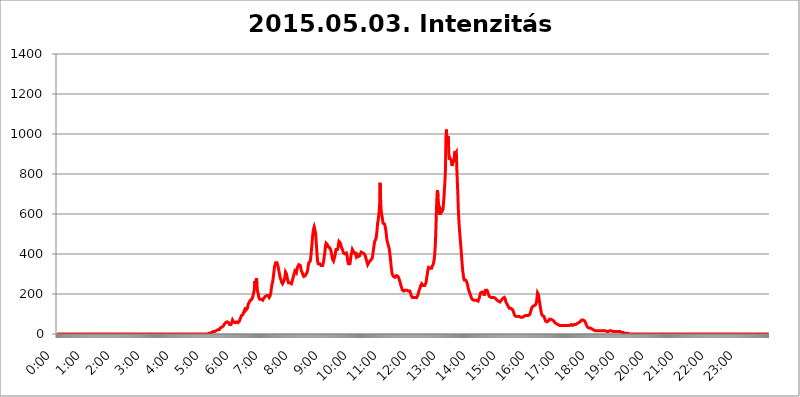
| Category | 2015.05.03. Intenzitás [W/m^2] |
|---|---|
| 0.0 | 0 |
| 0.0006944444444444445 | 0 |
| 0.001388888888888889 | 0 |
| 0.0020833333333333333 | 0 |
| 0.002777777777777778 | 0 |
| 0.003472222222222222 | 0 |
| 0.004166666666666667 | 0 |
| 0.004861111111111111 | 0 |
| 0.005555555555555556 | 0 |
| 0.0062499999999999995 | 0 |
| 0.006944444444444444 | 0 |
| 0.007638888888888889 | 0 |
| 0.008333333333333333 | 0 |
| 0.009027777777777779 | 0 |
| 0.009722222222222222 | 0 |
| 0.010416666666666666 | 0 |
| 0.011111111111111112 | 0 |
| 0.011805555555555555 | 0 |
| 0.012499999999999999 | 0 |
| 0.013194444444444444 | 0 |
| 0.013888888888888888 | 0 |
| 0.014583333333333332 | 0 |
| 0.015277777777777777 | 0 |
| 0.015972222222222224 | 0 |
| 0.016666666666666666 | 0 |
| 0.017361111111111112 | 0 |
| 0.018055555555555557 | 0 |
| 0.01875 | 0 |
| 0.019444444444444445 | 0 |
| 0.02013888888888889 | 0 |
| 0.020833333333333332 | 0 |
| 0.02152777777777778 | 0 |
| 0.022222222222222223 | 0 |
| 0.02291666666666667 | 0 |
| 0.02361111111111111 | 0 |
| 0.024305555555555556 | 0 |
| 0.024999999999999998 | 0 |
| 0.025694444444444447 | 0 |
| 0.02638888888888889 | 0 |
| 0.027083333333333334 | 0 |
| 0.027777777777777776 | 0 |
| 0.02847222222222222 | 0 |
| 0.029166666666666664 | 0 |
| 0.029861111111111113 | 0 |
| 0.030555555555555555 | 0 |
| 0.03125 | 0 |
| 0.03194444444444445 | 0 |
| 0.03263888888888889 | 0 |
| 0.03333333333333333 | 0 |
| 0.034027777777777775 | 0 |
| 0.034722222222222224 | 0 |
| 0.035416666666666666 | 0 |
| 0.036111111111111115 | 0 |
| 0.03680555555555556 | 0 |
| 0.0375 | 0 |
| 0.03819444444444444 | 0 |
| 0.03888888888888889 | 0 |
| 0.03958333333333333 | 0 |
| 0.04027777777777778 | 0 |
| 0.04097222222222222 | 0 |
| 0.041666666666666664 | 0 |
| 0.042361111111111106 | 0 |
| 0.04305555555555556 | 0 |
| 0.043750000000000004 | 0 |
| 0.044444444444444446 | 0 |
| 0.04513888888888889 | 0 |
| 0.04583333333333334 | 0 |
| 0.04652777777777778 | 0 |
| 0.04722222222222222 | 0 |
| 0.04791666666666666 | 0 |
| 0.04861111111111111 | 0 |
| 0.049305555555555554 | 0 |
| 0.049999999999999996 | 0 |
| 0.05069444444444445 | 0 |
| 0.051388888888888894 | 0 |
| 0.052083333333333336 | 0 |
| 0.05277777777777778 | 0 |
| 0.05347222222222222 | 0 |
| 0.05416666666666667 | 0 |
| 0.05486111111111111 | 0 |
| 0.05555555555555555 | 0 |
| 0.05625 | 0 |
| 0.05694444444444444 | 0 |
| 0.057638888888888885 | 0 |
| 0.05833333333333333 | 0 |
| 0.05902777777777778 | 0 |
| 0.059722222222222225 | 0 |
| 0.06041666666666667 | 0 |
| 0.061111111111111116 | 0 |
| 0.06180555555555556 | 0 |
| 0.0625 | 0 |
| 0.06319444444444444 | 0 |
| 0.06388888888888888 | 0 |
| 0.06458333333333334 | 0 |
| 0.06527777777777778 | 0 |
| 0.06597222222222222 | 0 |
| 0.06666666666666667 | 0 |
| 0.06736111111111111 | 0 |
| 0.06805555555555555 | 0 |
| 0.06874999999999999 | 0 |
| 0.06944444444444443 | 0 |
| 0.07013888888888889 | 0 |
| 0.07083333333333333 | 0 |
| 0.07152777777777779 | 0 |
| 0.07222222222222223 | 0 |
| 0.07291666666666667 | 0 |
| 0.07361111111111111 | 0 |
| 0.07430555555555556 | 0 |
| 0.075 | 0 |
| 0.07569444444444444 | 0 |
| 0.0763888888888889 | 0 |
| 0.07708333333333334 | 0 |
| 0.07777777777777778 | 0 |
| 0.07847222222222222 | 0 |
| 0.07916666666666666 | 0 |
| 0.0798611111111111 | 0 |
| 0.08055555555555556 | 0 |
| 0.08125 | 0 |
| 0.08194444444444444 | 0 |
| 0.08263888888888889 | 0 |
| 0.08333333333333333 | 0 |
| 0.08402777777777777 | 0 |
| 0.08472222222222221 | 0 |
| 0.08541666666666665 | 0 |
| 0.08611111111111112 | 0 |
| 0.08680555555555557 | 0 |
| 0.08750000000000001 | 0 |
| 0.08819444444444445 | 0 |
| 0.08888888888888889 | 0 |
| 0.08958333333333333 | 0 |
| 0.09027777777777778 | 0 |
| 0.09097222222222222 | 0 |
| 0.09166666666666667 | 0 |
| 0.09236111111111112 | 0 |
| 0.09305555555555556 | 0 |
| 0.09375 | 0 |
| 0.09444444444444444 | 0 |
| 0.09513888888888888 | 0 |
| 0.09583333333333333 | 0 |
| 0.09652777777777777 | 0 |
| 0.09722222222222222 | 0 |
| 0.09791666666666667 | 0 |
| 0.09861111111111111 | 0 |
| 0.09930555555555555 | 0 |
| 0.09999999999999999 | 0 |
| 0.10069444444444443 | 0 |
| 0.1013888888888889 | 0 |
| 0.10208333333333335 | 0 |
| 0.10277777777777779 | 0 |
| 0.10347222222222223 | 0 |
| 0.10416666666666667 | 0 |
| 0.10486111111111111 | 0 |
| 0.10555555555555556 | 0 |
| 0.10625 | 0 |
| 0.10694444444444444 | 0 |
| 0.1076388888888889 | 0 |
| 0.10833333333333334 | 0 |
| 0.10902777777777778 | 0 |
| 0.10972222222222222 | 0 |
| 0.1111111111111111 | 0 |
| 0.11180555555555556 | 0 |
| 0.11180555555555556 | 0 |
| 0.1125 | 0 |
| 0.11319444444444444 | 0 |
| 0.11388888888888889 | 0 |
| 0.11458333333333333 | 0 |
| 0.11527777777777777 | 0 |
| 0.11597222222222221 | 0 |
| 0.11666666666666665 | 0 |
| 0.1173611111111111 | 0 |
| 0.11805555555555557 | 0 |
| 0.11944444444444445 | 0 |
| 0.12013888888888889 | 0 |
| 0.12083333333333333 | 0 |
| 0.12152777777777778 | 0 |
| 0.12222222222222223 | 0 |
| 0.12291666666666667 | 0 |
| 0.12291666666666667 | 0 |
| 0.12361111111111112 | 0 |
| 0.12430555555555556 | 0 |
| 0.125 | 0 |
| 0.12569444444444444 | 0 |
| 0.12638888888888888 | 0 |
| 0.12708333333333333 | 0 |
| 0.16875 | 0 |
| 0.12847222222222224 | 0 |
| 0.12916666666666668 | 0 |
| 0.12986111111111112 | 0 |
| 0.13055555555555556 | 0 |
| 0.13125 | 0 |
| 0.13194444444444445 | 0 |
| 0.1326388888888889 | 0 |
| 0.13333333333333333 | 0 |
| 0.13402777777777777 | 0 |
| 0.13402777777777777 | 0 |
| 0.13472222222222222 | 0 |
| 0.13541666666666666 | 0 |
| 0.1361111111111111 | 0 |
| 0.13749999999999998 | 0 |
| 0.13819444444444443 | 0 |
| 0.1388888888888889 | 0 |
| 0.13958333333333334 | 0 |
| 0.14027777777777778 | 0 |
| 0.14097222222222222 | 0 |
| 0.14166666666666666 | 0 |
| 0.1423611111111111 | 0 |
| 0.14305555555555557 | 0 |
| 0.14375000000000002 | 0 |
| 0.14444444444444446 | 0 |
| 0.1451388888888889 | 0 |
| 0.1451388888888889 | 0 |
| 0.14652777777777778 | 0 |
| 0.14722222222222223 | 0 |
| 0.14791666666666667 | 0 |
| 0.1486111111111111 | 0 |
| 0.14930555555555555 | 0 |
| 0.15 | 0 |
| 0.15069444444444444 | 0 |
| 0.15138888888888888 | 0 |
| 0.15208333333333332 | 0 |
| 0.15277777777777776 | 0 |
| 0.15347222222222223 | 0 |
| 0.15416666666666667 | 0 |
| 0.15486111111111112 | 0 |
| 0.15555555555555556 | 0 |
| 0.15625 | 0 |
| 0.15694444444444444 | 0 |
| 0.15763888888888888 | 0 |
| 0.15833333333333333 | 0 |
| 0.15902777777777777 | 0 |
| 0.15972222222222224 | 0 |
| 0.16041666666666668 | 0 |
| 0.16111111111111112 | 0 |
| 0.16180555555555556 | 0 |
| 0.1625 | 0 |
| 0.16319444444444445 | 0 |
| 0.1638888888888889 | 0 |
| 0.16458333333333333 | 0 |
| 0.16527777777777777 | 0 |
| 0.16597222222222222 | 0 |
| 0.16666666666666666 | 0 |
| 0.1673611111111111 | 0 |
| 0.16805555555555554 | 0 |
| 0.16874999999999998 | 0 |
| 0.16944444444444443 | 0 |
| 0.17013888888888887 | 0 |
| 0.1708333333333333 | 0 |
| 0.17152777777777775 | 0 |
| 0.17222222222222225 | 0 |
| 0.1729166666666667 | 0 |
| 0.17361111111111113 | 0 |
| 0.17430555555555557 | 0 |
| 0.17500000000000002 | 0 |
| 0.17569444444444446 | 0 |
| 0.1763888888888889 | 0 |
| 0.17708333333333334 | 0 |
| 0.17777777777777778 | 0 |
| 0.17847222222222223 | 0 |
| 0.17916666666666667 | 0 |
| 0.1798611111111111 | 0 |
| 0.18055555555555555 | 0 |
| 0.18125 | 0 |
| 0.18194444444444444 | 0 |
| 0.1826388888888889 | 0 |
| 0.18333333333333335 | 0 |
| 0.1840277777777778 | 0 |
| 0.18472222222222223 | 0 |
| 0.18541666666666667 | 0 |
| 0.18611111111111112 | 0 |
| 0.18680555555555556 | 0 |
| 0.1875 | 0 |
| 0.18819444444444444 | 0 |
| 0.18888888888888888 | 0 |
| 0.18958333333333333 | 0 |
| 0.19027777777777777 | 0 |
| 0.1909722222222222 | 0 |
| 0.19166666666666665 | 0 |
| 0.19236111111111112 | 0 |
| 0.19305555555555554 | 0 |
| 0.19375 | 0 |
| 0.19444444444444445 | 0 |
| 0.1951388888888889 | 0 |
| 0.19583333333333333 | 0 |
| 0.19652777777777777 | 0 |
| 0.19722222222222222 | 0 |
| 0.19791666666666666 | 0 |
| 0.1986111111111111 | 0 |
| 0.19930555555555554 | 0 |
| 0.19999999999999998 | 0 |
| 0.20069444444444443 | 0 |
| 0.20138888888888887 | 0 |
| 0.2020833333333333 | 0 |
| 0.2027777777777778 | 0 |
| 0.2034722222222222 | 0 |
| 0.2041666666666667 | 0 |
| 0.20486111111111113 | 0 |
| 0.20555555555555557 | 0 |
| 0.20625000000000002 | 0 |
| 0.20694444444444446 | 0 |
| 0.2076388888888889 | 0 |
| 0.20833333333333334 | 0 |
| 0.20902777777777778 | 0 |
| 0.20972222222222223 | 0 |
| 0.21041666666666667 | 0 |
| 0.2111111111111111 | 0 |
| 0.21180555555555555 | 3.525 |
| 0.2125 | 3.525 |
| 0.21319444444444444 | 3.525 |
| 0.2138888888888889 | 3.525 |
| 0.21458333333333335 | 3.525 |
| 0.2152777777777778 | 3.525 |
| 0.21597222222222223 | 7.887 |
| 0.21666666666666667 | 7.887 |
| 0.21736111111111112 | 7.887 |
| 0.21805555555555556 | 12.257 |
| 0.21875 | 12.257 |
| 0.21944444444444444 | 12.257 |
| 0.22013888888888888 | 12.257 |
| 0.22083333333333333 | 12.257 |
| 0.22152777777777777 | 12.257 |
| 0.2222222222222222 | 12.257 |
| 0.22291666666666665 | 16.636 |
| 0.2236111111111111 | 16.636 |
| 0.22430555555555556 | 16.636 |
| 0.225 | 21.024 |
| 0.22569444444444445 | 21.024 |
| 0.2263888888888889 | 21.024 |
| 0.22708333333333333 | 21.024 |
| 0.22777777777777777 | 25.419 |
| 0.22847222222222222 | 29.823 |
| 0.22916666666666666 | 29.823 |
| 0.2298611111111111 | 29.823 |
| 0.23055555555555554 | 34.234 |
| 0.23124999999999998 | 34.234 |
| 0.23194444444444443 | 34.234 |
| 0.23263888888888887 | 38.653 |
| 0.2333333333333333 | 43.079 |
| 0.2340277777777778 | 47.511 |
| 0.2347222222222222 | 47.511 |
| 0.2354166666666667 | 51.951 |
| 0.23611111111111113 | 56.398 |
| 0.23680555555555557 | 60.85 |
| 0.23750000000000002 | 60.85 |
| 0.23819444444444446 | 60.85 |
| 0.2388888888888889 | 60.85 |
| 0.23958333333333334 | 60.85 |
| 0.24027777777777778 | 56.398 |
| 0.24097222222222223 | 51.951 |
| 0.24166666666666667 | 47.511 |
| 0.2423611111111111 | 43.079 |
| 0.24305555555555555 | 47.511 |
| 0.24375 | 47.511 |
| 0.24444444444444446 | 51.951 |
| 0.24513888888888888 | 60.85 |
| 0.24583333333333335 | 69.775 |
| 0.2465277777777778 | 69.775 |
| 0.24722222222222223 | 60.85 |
| 0.24791666666666667 | 56.398 |
| 0.24861111111111112 | 56.398 |
| 0.24930555555555556 | 56.398 |
| 0.25 | 56.398 |
| 0.25069444444444444 | 60.85 |
| 0.2513888888888889 | 60.85 |
| 0.2520833333333333 | 60.85 |
| 0.25277777777777777 | 60.85 |
| 0.2534722222222222 | 56.398 |
| 0.25416666666666665 | 56.398 |
| 0.2548611111111111 | 56.398 |
| 0.2555555555555556 | 65.31 |
| 0.25625000000000003 | 69.775 |
| 0.2569444444444445 | 78.722 |
| 0.2576388888888889 | 83.205 |
| 0.25833333333333336 | 92.184 |
| 0.2590277777777778 | 92.184 |
| 0.25972222222222224 | 92.184 |
| 0.2604166666666667 | 96.682 |
| 0.2611111111111111 | 105.69 |
| 0.26180555555555557 | 105.69 |
| 0.2625 | 110.201 |
| 0.26319444444444445 | 123.758 |
| 0.2638888888888889 | 132.814 |
| 0.26458333333333334 | 119.235 |
| 0.2652777777777778 | 119.235 |
| 0.2659722222222222 | 123.758 |
| 0.26666666666666666 | 128.284 |
| 0.2673611111111111 | 141.884 |
| 0.26805555555555555 | 150.964 |
| 0.26875 | 155.509 |
| 0.26944444444444443 | 160.056 |
| 0.2701388888888889 | 164.605 |
| 0.2708333333333333 | 169.156 |
| 0.27152777777777776 | 169.156 |
| 0.2722222222222222 | 173.709 |
| 0.27291666666666664 | 173.709 |
| 0.2736111111111111 | 169.156 |
| 0.2743055555555555 | 187.378 |
| 0.27499999999999997 | 191.937 |
| 0.27569444444444446 | 210.182 |
| 0.27638888888888885 | 219.309 |
| 0.27708333333333335 | 264.932 |
| 0.2777777777777778 | 251.251 |
| 0.27847222222222223 | 260.373 |
| 0.2791666666666667 | 278.603 |
| 0.2798611111111111 | 269.49 |
| 0.28055555555555556 | 219.309 |
| 0.28125 | 214.746 |
| 0.28194444444444444 | 201.058 |
| 0.2826388888888889 | 182.82 |
| 0.2833333333333333 | 178.264 |
| 0.28402777777777777 | 173.709 |
| 0.2847222222222222 | 173.709 |
| 0.28541666666666665 | 173.709 |
| 0.28611111111111115 | 173.709 |
| 0.28680555555555554 | 173.709 |
| 0.28750000000000003 | 173.709 |
| 0.2881944444444445 | 169.156 |
| 0.2888888888888889 | 173.709 |
| 0.28958333333333336 | 178.264 |
| 0.2902777777777778 | 182.82 |
| 0.29097222222222224 | 182.82 |
| 0.2916666666666667 | 187.378 |
| 0.2923611111111111 | 191.937 |
| 0.29305555555555557 | 191.937 |
| 0.29375 | 191.937 |
| 0.29444444444444445 | 191.937 |
| 0.2951388888888889 | 191.937 |
| 0.29583333333333334 | 191.937 |
| 0.2965277777777778 | 187.378 |
| 0.2972222222222222 | 182.82 |
| 0.29791666666666666 | 182.82 |
| 0.2986111111111111 | 191.937 |
| 0.29930555555555555 | 201.058 |
| 0.3 | 219.309 |
| 0.30069444444444443 | 237.564 |
| 0.3013888888888889 | 251.251 |
| 0.3020833333333333 | 260.373 |
| 0.30277777777777776 | 278.603 |
| 0.3034722222222222 | 296.808 |
| 0.30416666666666664 | 319.517 |
| 0.3048611111111111 | 337.639 |
| 0.3055555555555555 | 346.682 |
| 0.30624999999999997 | 355.712 |
| 0.3069444444444444 | 355.712 |
| 0.3076388888888889 | 355.712 |
| 0.30833333333333335 | 355.712 |
| 0.3090277777777778 | 346.682 |
| 0.30972222222222223 | 337.639 |
| 0.3104166666666667 | 324.052 |
| 0.3111111111111111 | 310.44 |
| 0.31180555555555556 | 296.808 |
| 0.3125 | 283.156 |
| 0.31319444444444444 | 278.603 |
| 0.3138888888888889 | 269.49 |
| 0.3145833333333333 | 260.373 |
| 0.31527777777777777 | 255.813 |
| 0.3159722222222222 | 251.251 |
| 0.31666666666666665 | 251.251 |
| 0.31736111111111115 | 260.373 |
| 0.31805555555555554 | 264.932 |
| 0.31875000000000003 | 274.047 |
| 0.3194444444444445 | 292.259 |
| 0.3201388888888889 | 310.44 |
| 0.32083333333333336 | 314.98 |
| 0.3215277777777778 | 301.354 |
| 0.32222222222222224 | 287.709 |
| 0.3229166666666667 | 274.047 |
| 0.3236111111111111 | 264.932 |
| 0.32430555555555557 | 255.813 |
| 0.325 | 255.813 |
| 0.32569444444444445 | 255.813 |
| 0.3263888888888889 | 255.813 |
| 0.32708333333333334 | 251.251 |
| 0.3277777777777778 | 251.251 |
| 0.3284722222222222 | 251.251 |
| 0.32916666666666666 | 255.813 |
| 0.3298611111111111 | 269.49 |
| 0.33055555555555555 | 278.603 |
| 0.33125 | 287.709 |
| 0.33194444444444443 | 296.808 |
| 0.3326388888888889 | 305.898 |
| 0.3333333333333333 | 314.98 |
| 0.3340277777777778 | 319.517 |
| 0.3347222222222222 | 314.98 |
| 0.3354166666666667 | 305.898 |
| 0.3361111111111111 | 319.517 |
| 0.3368055555555556 | 333.113 |
| 0.33749999999999997 | 337.639 |
| 0.33819444444444446 | 337.639 |
| 0.33888888888888885 | 346.682 |
| 0.33958333333333335 | 351.198 |
| 0.34027777777777773 | 351.198 |
| 0.34097222222222223 | 342.162 |
| 0.3416666666666666 | 328.584 |
| 0.3423611111111111 | 314.98 |
| 0.3430555555555555 | 310.44 |
| 0.34375 | 305.898 |
| 0.3444444444444445 | 296.808 |
| 0.3451388888888889 | 292.259 |
| 0.3458333333333334 | 287.709 |
| 0.34652777777777777 | 287.709 |
| 0.34722222222222227 | 287.709 |
| 0.34791666666666665 | 292.259 |
| 0.34861111111111115 | 296.808 |
| 0.34930555555555554 | 301.354 |
| 0.35000000000000003 | 301.354 |
| 0.3506944444444444 | 310.44 |
| 0.3513888888888889 | 324.052 |
| 0.3520833333333333 | 342.162 |
| 0.3527777777777778 | 355.712 |
| 0.3534722222222222 | 355.712 |
| 0.3541666666666667 | 355.712 |
| 0.3548611111111111 | 364.728 |
| 0.35555555555555557 | 382.715 |
| 0.35625 | 409.574 |
| 0.35694444444444445 | 436.27 |
| 0.3576388888888889 | 467.187 |
| 0.35833333333333334 | 493.475 |
| 0.3590277777777778 | 515.223 |
| 0.3597222222222222 | 528.2 |
| 0.36041666666666666 | 536.82 |
| 0.3611111111111111 | 528.2 |
| 0.36180555555555555 | 510.885 |
| 0.3625 | 502.192 |
| 0.36319444444444443 | 458.38 |
| 0.3638888888888889 | 422.943 |
| 0.3645833333333333 | 387.202 |
| 0.3652777777777778 | 360.221 |
| 0.3659722222222222 | 351.198 |
| 0.3666666666666667 | 346.682 |
| 0.3673611111111111 | 351.198 |
| 0.3680555555555556 | 351.198 |
| 0.36874999999999997 | 351.198 |
| 0.36944444444444446 | 346.682 |
| 0.37013888888888885 | 342.162 |
| 0.37083333333333335 | 342.162 |
| 0.37152777777777773 | 342.162 |
| 0.37222222222222223 | 342.162 |
| 0.3729166666666666 | 351.198 |
| 0.3736111111111111 | 364.728 |
| 0.3743055555555555 | 382.715 |
| 0.375 | 400.638 |
| 0.3756944444444445 | 422.943 |
| 0.3763888888888889 | 445.129 |
| 0.3770833333333334 | 453.968 |
| 0.37777777777777777 | 453.968 |
| 0.37847222222222227 | 453.968 |
| 0.37916666666666665 | 445.129 |
| 0.37986111111111115 | 436.27 |
| 0.38055555555555554 | 431.833 |
| 0.38125000000000003 | 431.833 |
| 0.3819444444444444 | 431.833 |
| 0.3826388888888889 | 431.833 |
| 0.3833333333333333 | 422.943 |
| 0.3840277777777778 | 414.035 |
| 0.3847222222222222 | 400.638 |
| 0.3854166666666667 | 387.202 |
| 0.3861111111111111 | 373.729 |
| 0.38680555555555557 | 369.23 |
| 0.3875 | 364.728 |
| 0.38819444444444445 | 360.221 |
| 0.3888888888888889 | 369.23 |
| 0.38958333333333334 | 391.685 |
| 0.3902777777777778 | 409.574 |
| 0.3909722222222222 | 422.943 |
| 0.39166666666666666 | 427.39 |
| 0.3923611111111111 | 427.39 |
| 0.39305555555555555 | 422.943 |
| 0.39375 | 431.833 |
| 0.39444444444444443 | 449.551 |
| 0.3951388888888889 | 462.786 |
| 0.3958333333333333 | 462.786 |
| 0.3965277777777778 | 458.38 |
| 0.3972222222222222 | 453.968 |
| 0.3979166666666667 | 445.129 |
| 0.3986111111111111 | 431.833 |
| 0.3993055555555556 | 427.39 |
| 0.39999999999999997 | 422.943 |
| 0.40069444444444446 | 414.035 |
| 0.40138888888888885 | 405.108 |
| 0.40208333333333335 | 400.638 |
| 0.40277777777777773 | 400.638 |
| 0.40347222222222223 | 400.638 |
| 0.4041666666666666 | 405.108 |
| 0.4048611111111111 | 405.108 |
| 0.4055555555555555 | 405.108 |
| 0.40625 | 396.164 |
| 0.4069444444444445 | 378.224 |
| 0.4076388888888889 | 360.221 |
| 0.4083333333333334 | 351.198 |
| 0.40902777777777777 | 346.682 |
| 0.40972222222222227 | 346.682 |
| 0.41041666666666665 | 351.198 |
| 0.41111111111111115 | 364.728 |
| 0.41180555555555554 | 387.202 |
| 0.41250000000000003 | 400.638 |
| 0.4131944444444444 | 409.574 |
| 0.4138888888888889 | 422.943 |
| 0.4145833333333333 | 418.492 |
| 0.4152777777777778 | 414.035 |
| 0.4159722222222222 | 405.108 |
| 0.4166666666666667 | 400.638 |
| 0.4173611111111111 | 400.638 |
| 0.41805555555555557 | 405.108 |
| 0.41875 | 396.164 |
| 0.41944444444444445 | 387.202 |
| 0.4201388888888889 | 387.202 |
| 0.42083333333333334 | 396.164 |
| 0.4215277777777778 | 391.685 |
| 0.4222222222222222 | 387.202 |
| 0.42291666666666666 | 387.202 |
| 0.4236111111111111 | 387.202 |
| 0.42430555555555555 | 391.685 |
| 0.425 | 400.638 |
| 0.42569444444444443 | 405.108 |
| 0.4263888888888889 | 409.574 |
| 0.4270833333333333 | 409.574 |
| 0.4277777777777778 | 405.108 |
| 0.4284722222222222 | 405.108 |
| 0.4291666666666667 | 400.638 |
| 0.4298611111111111 | 400.638 |
| 0.4305555555555556 | 400.638 |
| 0.43124999999999997 | 400.638 |
| 0.43194444444444446 | 391.685 |
| 0.43263888888888885 | 382.715 |
| 0.43333333333333335 | 373.729 |
| 0.43402777777777773 | 364.728 |
| 0.43472222222222223 | 355.712 |
| 0.4354166666666666 | 346.682 |
| 0.4361111111111111 | 351.198 |
| 0.4368055555555555 | 351.198 |
| 0.4375 | 360.221 |
| 0.4381944444444445 | 360.221 |
| 0.4388888888888889 | 364.728 |
| 0.4395833333333334 | 369.23 |
| 0.44027777777777777 | 369.23 |
| 0.44097222222222227 | 373.729 |
| 0.44166666666666665 | 378.224 |
| 0.44236111111111115 | 391.685 |
| 0.44305555555555554 | 409.574 |
| 0.44375000000000003 | 427.39 |
| 0.4444444444444444 | 445.129 |
| 0.4451388888888889 | 462.786 |
| 0.4458333333333333 | 467.187 |
| 0.4465277777777778 | 471.582 |
| 0.4472222222222222 | 480.356 |
| 0.4479166666666667 | 497.836 |
| 0.4486111111111111 | 523.88 |
| 0.44930555555555557 | 553.986 |
| 0.45 | 566.793 |
| 0.45069444444444445 | 571.049 |
| 0.4513888888888889 | 609.062 |
| 0.45208333333333334 | 638.256 |
| 0.4527777777777778 | 755.766 |
| 0.4534722222222222 | 675.311 |
| 0.45416666666666666 | 625.784 |
| 0.4548611111111111 | 600.661 |
| 0.45555555555555555 | 588.009 |
| 0.45625 | 571.049 |
| 0.45694444444444443 | 553.986 |
| 0.4576388888888889 | 549.704 |
| 0.4583333333333333 | 549.704 |
| 0.4590277777777778 | 549.704 |
| 0.4597222222222222 | 541.121 |
| 0.4604166666666667 | 528.2 |
| 0.4611111111111111 | 510.885 |
| 0.4618055555555556 | 489.108 |
| 0.46249999999999997 | 467.187 |
| 0.46319444444444446 | 458.38 |
| 0.46388888888888885 | 449.551 |
| 0.46458333333333335 | 445.129 |
| 0.46527777777777773 | 431.833 |
| 0.46597222222222223 | 418.492 |
| 0.4666666666666666 | 396.164 |
| 0.4673611111111111 | 373.729 |
| 0.4680555555555555 | 346.682 |
| 0.46875 | 324.052 |
| 0.4694444444444445 | 305.898 |
| 0.4701388888888889 | 296.808 |
| 0.4708333333333334 | 292.259 |
| 0.47152777777777777 | 287.709 |
| 0.47222222222222227 | 283.156 |
| 0.47291666666666665 | 283.156 |
| 0.47361111111111115 | 283.156 |
| 0.47430555555555554 | 287.709 |
| 0.47500000000000003 | 287.709 |
| 0.4756944444444444 | 292.259 |
| 0.4763888888888889 | 292.259 |
| 0.4770833333333333 | 287.709 |
| 0.4777777777777778 | 287.709 |
| 0.4784722222222222 | 283.156 |
| 0.4791666666666667 | 278.603 |
| 0.4798611111111111 | 269.49 |
| 0.48055555555555557 | 264.932 |
| 0.48125 | 255.813 |
| 0.48194444444444445 | 242.127 |
| 0.4826388888888889 | 237.564 |
| 0.48333333333333334 | 228.436 |
| 0.4840277777777778 | 219.309 |
| 0.4847222222222222 | 214.746 |
| 0.48541666666666666 | 214.746 |
| 0.4861111111111111 | 214.746 |
| 0.48680555555555555 | 219.309 |
| 0.4875 | 219.309 |
| 0.48819444444444443 | 219.309 |
| 0.4888888888888889 | 223.873 |
| 0.4895833333333333 | 219.309 |
| 0.4902777777777778 | 219.309 |
| 0.4909722222222222 | 219.309 |
| 0.4916666666666667 | 214.746 |
| 0.4923611111111111 | 214.746 |
| 0.4930555555555556 | 214.746 |
| 0.49374999999999997 | 214.746 |
| 0.49444444444444446 | 214.746 |
| 0.49513888888888885 | 210.182 |
| 0.49583333333333335 | 201.058 |
| 0.49652777777777773 | 191.937 |
| 0.49722222222222223 | 187.378 |
| 0.4979166666666666 | 182.82 |
| 0.4986111111111111 | 178.264 |
| 0.4993055555555555 | 182.82 |
| 0.5 | 182.82 |
| 0.5006944444444444 | 182.82 |
| 0.5013888888888889 | 182.82 |
| 0.5020833333333333 | 182.82 |
| 0.5027777777777778 | 182.82 |
| 0.5034722222222222 | 178.264 |
| 0.5041666666666667 | 182.82 |
| 0.5048611111111111 | 187.378 |
| 0.5055555555555555 | 191.937 |
| 0.50625 | 201.058 |
| 0.5069444444444444 | 210.182 |
| 0.5076388888888889 | 219.309 |
| 0.5083333333333333 | 223.873 |
| 0.5090277777777777 | 233 |
| 0.5097222222222222 | 242.127 |
| 0.5104166666666666 | 246.689 |
| 0.5111111111111112 | 251.251 |
| 0.5118055555555555 | 251.251 |
| 0.5125000000000001 | 246.689 |
| 0.5131944444444444 | 242.127 |
| 0.513888888888889 | 237.564 |
| 0.5145833333333333 | 242.127 |
| 0.5152777777777778 | 242.127 |
| 0.5159722222222222 | 246.689 |
| 0.5166666666666667 | 251.251 |
| 0.517361111111111 | 260.373 |
| 0.5180555555555556 | 278.603 |
| 0.5187499999999999 | 292.259 |
| 0.5194444444444445 | 310.44 |
| 0.5201388888888888 | 324.052 |
| 0.5208333333333334 | 333.113 |
| 0.5215277777777778 | 337.639 |
| 0.5222222222222223 | 333.113 |
| 0.5229166666666667 | 328.584 |
| 0.5236111111111111 | 324.052 |
| 0.5243055555555556 | 324.052 |
| 0.525 | 328.584 |
| 0.5256944444444445 | 337.639 |
| 0.5263888888888889 | 342.162 |
| 0.5270833333333333 | 346.682 |
| 0.5277777777777778 | 355.712 |
| 0.5284722222222222 | 369.23 |
| 0.5291666666666667 | 387.202 |
| 0.5298611111111111 | 422.943 |
| 0.5305555555555556 | 471.582 |
| 0.53125 | 545.416 |
| 0.5319444444444444 | 629.948 |
| 0.5326388888888889 | 699.717 |
| 0.5333333333333333 | 719.877 |
| 0.5340277777777778 | 687.544 |
| 0.5347222222222222 | 650.667 |
| 0.5354166666666667 | 617.436 |
| 0.5361111111111111 | 596.45 |
| 0.5368055555555555 | 600.661 |
| 0.5375 | 621.613 |
| 0.5381944444444444 | 625.784 |
| 0.5388888888888889 | 609.062 |
| 0.5395833333333333 | 604.864 |
| 0.5402777777777777 | 609.062 |
| 0.5409722222222222 | 621.613 |
| 0.5416666666666666 | 650.667 |
| 0.5423611111111112 | 683.473 |
| 0.5430555555555555 | 723.889 |
| 0.5437500000000001 | 763.674 |
| 0.5444444444444444 | 818.392 |
| 0.545138888888889 | 981.244 |
| 0.5458333333333333 | 1022.323 |
| 0.5465277777777778 | 958.814 |
| 0.5472222222222222 | 947.58 |
| 0.5479166666666667 | 988.714 |
| 0.548611111111111 | 970.034 |
| 0.5493055555555556 | 894.885 |
| 0.5499999999999999 | 872.114 |
| 0.5506944444444445 | 879.719 |
| 0.5513888888888888 | 879.719 |
| 0.5520833333333334 | 879.719 |
| 0.5527777777777778 | 868.305 |
| 0.5534722222222223 | 841.526 |
| 0.5541666666666667 | 837.682 |
| 0.5548611111111111 | 853.029 |
| 0.5555555555555556 | 860.676 |
| 0.55625 | 860.676 |
| 0.5569444444444445 | 883.516 |
| 0.5576388888888889 | 913.766 |
| 0.5583333333333333 | 902.447 |
| 0.5590277777777778 | 906.223 |
| 0.5597222222222222 | 909.996 |
| 0.5604166666666667 | 826.123 |
| 0.5611111111111111 | 763.674 |
| 0.5618055555555556 | 703.762 |
| 0.5625 | 625.784 |
| 0.5631944444444444 | 575.299 |
| 0.5638888888888889 | 532.513 |
| 0.5645833333333333 | 502.192 |
| 0.5652777777777778 | 471.582 |
| 0.5659722222222222 | 440.702 |
| 0.5666666666666667 | 409.574 |
| 0.5673611111111111 | 373.729 |
| 0.5680555555555555 | 342.162 |
| 0.56875 | 314.98 |
| 0.5694444444444444 | 296.808 |
| 0.5701388888888889 | 278.603 |
| 0.5708333333333333 | 269.49 |
| 0.5715277777777777 | 269.49 |
| 0.5722222222222222 | 269.49 |
| 0.5729166666666666 | 269.49 |
| 0.5736111111111112 | 264.932 |
| 0.5743055555555555 | 260.373 |
| 0.5750000000000001 | 251.251 |
| 0.5756944444444444 | 242.127 |
| 0.576388888888889 | 228.436 |
| 0.5770833333333333 | 219.309 |
| 0.5777777777777778 | 214.746 |
| 0.5784722222222222 | 205.62 |
| 0.5791666666666667 | 201.058 |
| 0.579861111111111 | 191.937 |
| 0.5805555555555556 | 182.82 |
| 0.5812499999999999 | 178.264 |
| 0.5819444444444445 | 173.709 |
| 0.5826388888888888 | 169.156 |
| 0.5833333333333334 | 169.156 |
| 0.5840277777777778 | 169.156 |
| 0.5847222222222223 | 169.156 |
| 0.5854166666666667 | 169.156 |
| 0.5861111111111111 | 169.156 |
| 0.5868055555555556 | 173.709 |
| 0.5875 | 173.709 |
| 0.5881944444444445 | 169.156 |
| 0.5888888888888889 | 164.605 |
| 0.5895833333333333 | 164.605 |
| 0.5902777777777778 | 164.605 |
| 0.5909722222222222 | 169.156 |
| 0.5916666666666667 | 178.264 |
| 0.5923611111111111 | 187.378 |
| 0.5930555555555556 | 196.497 |
| 0.59375 | 205.62 |
| 0.5944444444444444 | 210.182 |
| 0.5951388888888889 | 210.182 |
| 0.5958333333333333 | 210.182 |
| 0.5965277777777778 | 210.182 |
| 0.5972222222222222 | 210.182 |
| 0.5979166666666667 | 205.62 |
| 0.5986111111111111 | 191.937 |
| 0.5993055555555555 | 191.937 |
| 0.6 | 210.182 |
| 0.6006944444444444 | 219.309 |
| 0.6013888888888889 | 223.873 |
| 0.6020833333333333 | 219.309 |
| 0.6027777777777777 | 219.309 |
| 0.6034722222222222 | 214.746 |
| 0.6041666666666666 | 205.62 |
| 0.6048611111111112 | 196.497 |
| 0.6055555555555555 | 191.937 |
| 0.6062500000000001 | 187.378 |
| 0.6069444444444444 | 187.378 |
| 0.607638888888889 | 182.82 |
| 0.6083333333333333 | 182.82 |
| 0.6090277777777778 | 182.82 |
| 0.6097222222222222 | 182.82 |
| 0.6104166666666667 | 182.82 |
| 0.611111111111111 | 182.82 |
| 0.6118055555555556 | 187.378 |
| 0.6124999999999999 | 182.82 |
| 0.6131944444444445 | 182.82 |
| 0.6138888888888888 | 182.82 |
| 0.6145833333333334 | 178.264 |
| 0.6152777777777778 | 178.264 |
| 0.6159722222222223 | 173.709 |
| 0.6166666666666667 | 169.156 |
| 0.6173611111111111 | 164.605 |
| 0.6180555555555556 | 164.605 |
| 0.61875 | 164.605 |
| 0.6194444444444445 | 164.605 |
| 0.6201388888888889 | 160.056 |
| 0.6208333333333333 | 160.056 |
| 0.6215277777777778 | 164.605 |
| 0.6222222222222222 | 164.605 |
| 0.6229166666666667 | 169.156 |
| 0.6236111111111111 | 169.156 |
| 0.6243055555555556 | 173.709 |
| 0.625 | 178.264 |
| 0.6256944444444444 | 182.82 |
| 0.6263888888888889 | 182.82 |
| 0.6270833333333333 | 182.82 |
| 0.6277777777777778 | 182.82 |
| 0.6284722222222222 | 173.709 |
| 0.6291666666666667 | 160.056 |
| 0.6298611111111111 | 155.509 |
| 0.6305555555555555 | 150.964 |
| 0.63125 | 146.423 |
| 0.6319444444444444 | 141.884 |
| 0.6326388888888889 | 137.347 |
| 0.6333333333333333 | 137.347 |
| 0.6340277777777777 | 128.284 |
| 0.6347222222222222 | 128.284 |
| 0.6354166666666666 | 128.284 |
| 0.6361111111111112 | 128.284 |
| 0.6368055555555555 | 128.284 |
| 0.6375000000000001 | 123.758 |
| 0.6381944444444444 | 123.758 |
| 0.638888888888889 | 119.235 |
| 0.6395833333333333 | 114.716 |
| 0.6402777777777778 | 105.69 |
| 0.6409722222222222 | 101.184 |
| 0.6416666666666667 | 92.184 |
| 0.642361111111111 | 92.184 |
| 0.6430555555555556 | 87.692 |
| 0.6437499999999999 | 87.692 |
| 0.6444444444444445 | 83.205 |
| 0.6451388888888888 | 87.692 |
| 0.6458333333333334 | 87.692 |
| 0.6465277777777778 | 87.692 |
| 0.6472222222222223 | 92.184 |
| 0.6479166666666667 | 87.692 |
| 0.6486111111111111 | 87.692 |
| 0.6493055555555556 | 87.692 |
| 0.65 | 83.205 |
| 0.6506944444444445 | 83.205 |
| 0.6513888888888889 | 83.205 |
| 0.6520833333333333 | 83.205 |
| 0.6527777777777778 | 83.205 |
| 0.6534722222222222 | 87.692 |
| 0.6541666666666667 | 87.692 |
| 0.6548611111111111 | 92.184 |
| 0.6555555555555556 | 92.184 |
| 0.65625 | 92.184 |
| 0.6569444444444444 | 92.184 |
| 0.6576388888888889 | 92.184 |
| 0.6583333333333333 | 92.184 |
| 0.6590277777777778 | 87.692 |
| 0.6597222222222222 | 92.184 |
| 0.6604166666666667 | 92.184 |
| 0.6611111111111111 | 92.184 |
| 0.6618055555555555 | 92.184 |
| 0.6625 | 96.682 |
| 0.6631944444444444 | 101.184 |
| 0.6638888888888889 | 110.201 |
| 0.6645833333333333 | 119.235 |
| 0.6652777777777777 | 128.284 |
| 0.6659722222222222 | 132.814 |
| 0.6666666666666666 | 137.347 |
| 0.6673611111111111 | 141.884 |
| 0.6680555555555556 | 141.884 |
| 0.6687500000000001 | 141.884 |
| 0.6694444444444444 | 141.884 |
| 0.6701388888888888 | 141.884 |
| 0.6708333333333334 | 146.423 |
| 0.6715277777777778 | 146.423 |
| 0.6722222222222222 | 160.056 |
| 0.6729166666666666 | 182.82 |
| 0.6736111111111112 | 205.62 |
| 0.6743055555555556 | 210.182 |
| 0.6749999999999999 | 196.497 |
| 0.6756944444444444 | 178.264 |
| 0.6763888888888889 | 160.056 |
| 0.6770833333333334 | 146.423 |
| 0.6777777777777777 | 128.284 |
| 0.6784722222222223 | 114.716 |
| 0.6791666666666667 | 101.184 |
| 0.6798611111111111 | 96.682 |
| 0.6805555555555555 | 92.184 |
| 0.68125 | 92.184 |
| 0.6819444444444445 | 87.692 |
| 0.6826388888888889 | 87.692 |
| 0.6833333333333332 | 83.205 |
| 0.6840277777777778 | 74.246 |
| 0.6847222222222222 | 65.31 |
| 0.6854166666666667 | 65.31 |
| 0.686111111111111 | 65.31 |
| 0.6868055555555556 | 60.85 |
| 0.6875 | 60.85 |
| 0.6881944444444444 | 65.31 |
| 0.688888888888889 | 65.31 |
| 0.6895833333333333 | 69.775 |
| 0.6902777777777778 | 74.246 |
| 0.6909722222222222 | 74.246 |
| 0.6916666666666668 | 74.246 |
| 0.6923611111111111 | 74.246 |
| 0.6930555555555555 | 69.775 |
| 0.69375 | 69.775 |
| 0.6944444444444445 | 69.775 |
| 0.6951388888888889 | 69.775 |
| 0.6958333333333333 | 65.31 |
| 0.6965277777777777 | 65.31 |
| 0.6972222222222223 | 60.85 |
| 0.6979166666666666 | 56.398 |
| 0.6986111111111111 | 56.398 |
| 0.6993055555555556 | 56.398 |
| 0.7000000000000001 | 51.951 |
| 0.7006944444444444 | 51.951 |
| 0.7013888888888888 | 51.951 |
| 0.7020833333333334 | 47.511 |
| 0.7027777777777778 | 47.511 |
| 0.7034722222222222 | 47.511 |
| 0.7041666666666666 | 43.079 |
| 0.7048611111111112 | 43.079 |
| 0.7055555555555556 | 43.079 |
| 0.7062499999999999 | 43.079 |
| 0.7069444444444444 | 43.079 |
| 0.7076388888888889 | 43.079 |
| 0.7083333333333334 | 43.079 |
| 0.7090277777777777 | 43.079 |
| 0.7097222222222223 | 43.079 |
| 0.7104166666666667 | 43.079 |
| 0.7111111111111111 | 43.079 |
| 0.7118055555555555 | 43.079 |
| 0.7125 | 43.079 |
| 0.7131944444444445 | 43.079 |
| 0.7138888888888889 | 43.079 |
| 0.7145833333333332 | 43.079 |
| 0.7152777777777778 | 47.511 |
| 0.7159722222222222 | 47.511 |
| 0.7166666666666667 | 43.079 |
| 0.717361111111111 | 43.079 |
| 0.7180555555555556 | 43.079 |
| 0.71875 | 43.079 |
| 0.7194444444444444 | 47.511 |
| 0.720138888888889 | 47.511 |
| 0.7208333333333333 | 47.511 |
| 0.7215277777777778 | 47.511 |
| 0.7222222222222222 | 43.079 |
| 0.7229166666666668 | 43.079 |
| 0.7236111111111111 | 43.079 |
| 0.7243055555555555 | 43.079 |
| 0.725 | 47.511 |
| 0.7256944444444445 | 47.511 |
| 0.7263888888888889 | 47.511 |
| 0.7270833333333333 | 47.511 |
| 0.7277777777777777 | 47.511 |
| 0.7284722222222223 | 47.511 |
| 0.7291666666666666 | 51.951 |
| 0.7298611111111111 | 51.951 |
| 0.7305555555555556 | 56.398 |
| 0.7312500000000001 | 56.398 |
| 0.7319444444444444 | 56.398 |
| 0.7326388888888888 | 60.85 |
| 0.7333333333333334 | 60.85 |
| 0.7340277777777778 | 65.31 |
| 0.7347222222222222 | 65.31 |
| 0.7354166666666666 | 69.775 |
| 0.7361111111111112 | 74.246 |
| 0.7368055555555556 | 74.246 |
| 0.7374999999999999 | 69.775 |
| 0.7381944444444444 | 69.775 |
| 0.7388888888888889 | 65.31 |
| 0.7395833333333334 | 65.31 |
| 0.7402777777777777 | 60.85 |
| 0.7409722222222223 | 56.398 |
| 0.7416666666666667 | 51.951 |
| 0.7423611111111111 | 43.079 |
| 0.7430555555555555 | 38.653 |
| 0.74375 | 34.234 |
| 0.7444444444444445 | 29.823 |
| 0.7451388888888889 | 29.823 |
| 0.7458333333333332 | 29.823 |
| 0.7465277777777778 | 29.823 |
| 0.7472222222222222 | 29.823 |
| 0.7479166666666667 | 29.823 |
| 0.748611111111111 | 29.823 |
| 0.7493055555555556 | 29.823 |
| 0.75 | 25.419 |
| 0.7506944444444444 | 25.419 |
| 0.751388888888889 | 21.024 |
| 0.7520833333333333 | 21.024 |
| 0.7527777777777778 | 21.024 |
| 0.7534722222222222 | 21.024 |
| 0.7541666666666668 | 16.636 |
| 0.7548611111111111 | 16.636 |
| 0.7555555555555555 | 16.636 |
| 0.75625 | 16.636 |
| 0.7569444444444445 | 16.636 |
| 0.7576388888888889 | 16.636 |
| 0.7583333333333333 | 16.636 |
| 0.7590277777777777 | 16.636 |
| 0.7597222222222223 | 16.636 |
| 0.7604166666666666 | 16.636 |
| 0.7611111111111111 | 16.636 |
| 0.7618055555555556 | 16.636 |
| 0.7625000000000001 | 16.636 |
| 0.7631944444444444 | 16.636 |
| 0.7638888888888888 | 16.636 |
| 0.7645833333333334 | 16.636 |
| 0.7652777777777778 | 16.636 |
| 0.7659722222222222 | 21.024 |
| 0.7666666666666666 | 16.636 |
| 0.7673611111111112 | 16.636 |
| 0.7680555555555556 | 16.636 |
| 0.7687499999999999 | 16.636 |
| 0.7694444444444444 | 16.636 |
| 0.7701388888888889 | 12.257 |
| 0.7708333333333334 | 12.257 |
| 0.7715277777777777 | 12.257 |
| 0.7722222222222223 | 12.257 |
| 0.7729166666666667 | 12.257 |
| 0.7736111111111111 | 16.636 |
| 0.7743055555555555 | 16.636 |
| 0.775 | 16.636 |
| 0.7756944444444445 | 16.636 |
| 0.7763888888888889 | 16.636 |
| 0.7770833333333332 | 16.636 |
| 0.7777777777777778 | 12.257 |
| 0.7784722222222222 | 12.257 |
| 0.7791666666666667 | 12.257 |
| 0.779861111111111 | 12.257 |
| 0.7805555555555556 | 12.257 |
| 0.78125 | 12.257 |
| 0.7819444444444444 | 12.257 |
| 0.782638888888889 | 12.257 |
| 0.7833333333333333 | 12.257 |
| 0.7840277777777778 | 12.257 |
| 0.7847222222222222 | 12.257 |
| 0.7854166666666668 | 12.257 |
| 0.7861111111111111 | 12.257 |
| 0.7868055555555555 | 12.257 |
| 0.7875 | 12.257 |
| 0.7881944444444445 | 12.257 |
| 0.7888888888888889 | 12.257 |
| 0.7895833333333333 | 12.257 |
| 0.7902777777777777 | 12.257 |
| 0.7909722222222223 | 12.257 |
| 0.7916666666666666 | 7.887 |
| 0.7923611111111111 | 7.887 |
| 0.7930555555555556 | 7.887 |
| 0.7937500000000001 | 7.887 |
| 0.7944444444444444 | 3.525 |
| 0.7951388888888888 | 3.525 |
| 0.7958333333333334 | 3.525 |
| 0.7965277777777778 | 3.525 |
| 0.7972222222222222 | 3.525 |
| 0.7979166666666666 | 3.525 |
| 0.7986111111111112 | 3.525 |
| 0.7993055555555556 | 3.525 |
| 0.7999999999999999 | 3.525 |
| 0.8006944444444444 | 3.525 |
| 0.8013888888888889 | 0 |
| 0.8020833333333334 | 0 |
| 0.8027777777777777 | 0 |
| 0.8034722222222223 | 0 |
| 0.8041666666666667 | 0 |
| 0.8048611111111111 | 0 |
| 0.8055555555555555 | 0 |
| 0.80625 | 0 |
| 0.8069444444444445 | 0 |
| 0.8076388888888889 | 0 |
| 0.8083333333333332 | 0 |
| 0.8090277777777778 | 0 |
| 0.8097222222222222 | 0 |
| 0.8104166666666667 | 0 |
| 0.811111111111111 | 0 |
| 0.8118055555555556 | 0 |
| 0.8125 | 0 |
| 0.8131944444444444 | 0 |
| 0.813888888888889 | 0 |
| 0.8145833333333333 | 0 |
| 0.8152777777777778 | 0 |
| 0.8159722222222222 | 0 |
| 0.8166666666666668 | 0 |
| 0.8173611111111111 | 0 |
| 0.8180555555555555 | 0 |
| 0.81875 | 0 |
| 0.8194444444444445 | 0 |
| 0.8201388888888889 | 0 |
| 0.8208333333333333 | 0 |
| 0.8215277777777777 | 0 |
| 0.8222222222222223 | 0 |
| 0.8229166666666666 | 0 |
| 0.8236111111111111 | 0 |
| 0.8243055555555556 | 0 |
| 0.8250000000000001 | 0 |
| 0.8256944444444444 | 0 |
| 0.8263888888888888 | 0 |
| 0.8270833333333334 | 0 |
| 0.8277777777777778 | 0 |
| 0.8284722222222222 | 0 |
| 0.8291666666666666 | 0 |
| 0.8298611111111112 | 0 |
| 0.8305555555555556 | 0 |
| 0.8312499999999999 | 0 |
| 0.8319444444444444 | 0 |
| 0.8326388888888889 | 0 |
| 0.8333333333333334 | 0 |
| 0.8340277777777777 | 0 |
| 0.8347222222222223 | 0 |
| 0.8354166666666667 | 0 |
| 0.8361111111111111 | 0 |
| 0.8368055555555555 | 0 |
| 0.8375 | 0 |
| 0.8381944444444445 | 0 |
| 0.8388888888888889 | 0 |
| 0.8395833333333332 | 0 |
| 0.8402777777777778 | 0 |
| 0.8409722222222222 | 0 |
| 0.8416666666666667 | 0 |
| 0.842361111111111 | 0 |
| 0.8430555555555556 | 0 |
| 0.84375 | 0 |
| 0.8444444444444444 | 0 |
| 0.845138888888889 | 0 |
| 0.8458333333333333 | 0 |
| 0.8465277777777778 | 0 |
| 0.8472222222222222 | 0 |
| 0.8479166666666668 | 0 |
| 0.8486111111111111 | 0 |
| 0.8493055555555555 | 0 |
| 0.85 | 0 |
| 0.8506944444444445 | 0 |
| 0.8513888888888889 | 0 |
| 0.8520833333333333 | 0 |
| 0.8527777777777777 | 0 |
| 0.8534722222222223 | 0 |
| 0.8541666666666666 | 0 |
| 0.8548611111111111 | 0 |
| 0.8555555555555556 | 0 |
| 0.8562500000000001 | 0 |
| 0.8569444444444444 | 0 |
| 0.8576388888888888 | 0 |
| 0.8583333333333334 | 0 |
| 0.8590277777777778 | 0 |
| 0.8597222222222222 | 0 |
| 0.8604166666666666 | 0 |
| 0.8611111111111112 | 0 |
| 0.8618055555555556 | 0 |
| 0.8624999999999999 | 0 |
| 0.8631944444444444 | 0 |
| 0.8638888888888889 | 0 |
| 0.8645833333333334 | 0 |
| 0.8652777777777777 | 0 |
| 0.8659722222222223 | 0 |
| 0.8666666666666667 | 0 |
| 0.8673611111111111 | 0 |
| 0.8680555555555555 | 0 |
| 0.86875 | 0 |
| 0.8694444444444445 | 0 |
| 0.8701388888888889 | 0 |
| 0.8708333333333332 | 0 |
| 0.8715277777777778 | 0 |
| 0.8722222222222222 | 0 |
| 0.8729166666666667 | 0 |
| 0.873611111111111 | 0 |
| 0.8743055555555556 | 0 |
| 0.875 | 0 |
| 0.8756944444444444 | 0 |
| 0.876388888888889 | 0 |
| 0.8770833333333333 | 0 |
| 0.8777777777777778 | 0 |
| 0.8784722222222222 | 0 |
| 0.8791666666666668 | 0 |
| 0.8798611111111111 | 0 |
| 0.8805555555555555 | 0 |
| 0.88125 | 0 |
| 0.8819444444444445 | 0 |
| 0.8826388888888889 | 0 |
| 0.8833333333333333 | 0 |
| 0.8840277777777777 | 0 |
| 0.8847222222222223 | 0 |
| 0.8854166666666666 | 0 |
| 0.8861111111111111 | 0 |
| 0.8868055555555556 | 0 |
| 0.8875000000000001 | 0 |
| 0.8881944444444444 | 0 |
| 0.8888888888888888 | 0 |
| 0.8895833333333334 | 0 |
| 0.8902777777777778 | 0 |
| 0.8909722222222222 | 0 |
| 0.8916666666666666 | 0 |
| 0.8923611111111112 | 0 |
| 0.8930555555555556 | 0 |
| 0.8937499999999999 | 0 |
| 0.8944444444444444 | 0 |
| 0.8951388888888889 | 0 |
| 0.8958333333333334 | 0 |
| 0.8965277777777777 | 0 |
| 0.8972222222222223 | 0 |
| 0.8979166666666667 | 0 |
| 0.8986111111111111 | 0 |
| 0.8993055555555555 | 0 |
| 0.9 | 0 |
| 0.9006944444444445 | 0 |
| 0.9013888888888889 | 0 |
| 0.9020833333333332 | 0 |
| 0.9027777777777778 | 0 |
| 0.9034722222222222 | 0 |
| 0.9041666666666667 | 0 |
| 0.904861111111111 | 0 |
| 0.9055555555555556 | 0 |
| 0.90625 | 0 |
| 0.9069444444444444 | 0 |
| 0.907638888888889 | 0 |
| 0.9083333333333333 | 0 |
| 0.9090277777777778 | 0 |
| 0.9097222222222222 | 0 |
| 0.9104166666666668 | 0 |
| 0.9111111111111111 | 0 |
| 0.9118055555555555 | 0 |
| 0.9125 | 0 |
| 0.9131944444444445 | 0 |
| 0.9138888888888889 | 0 |
| 0.9145833333333333 | 0 |
| 0.9152777777777777 | 0 |
| 0.9159722222222223 | 0 |
| 0.9166666666666666 | 0 |
| 0.9173611111111111 | 0 |
| 0.9180555555555556 | 0 |
| 0.9187500000000001 | 0 |
| 0.9194444444444444 | 0 |
| 0.9201388888888888 | 0 |
| 0.9208333333333334 | 0 |
| 0.9215277777777778 | 0 |
| 0.9222222222222222 | 0 |
| 0.9229166666666666 | 0 |
| 0.9236111111111112 | 0 |
| 0.9243055555555556 | 0 |
| 0.9249999999999999 | 0 |
| 0.9256944444444444 | 0 |
| 0.9263888888888889 | 0 |
| 0.9270833333333334 | 0 |
| 0.9277777777777777 | 0 |
| 0.9284722222222223 | 0 |
| 0.9291666666666667 | 0 |
| 0.9298611111111111 | 0 |
| 0.9305555555555555 | 0 |
| 0.93125 | 0 |
| 0.9319444444444445 | 0 |
| 0.9326388888888889 | 0 |
| 0.9333333333333332 | 0 |
| 0.9340277777777778 | 0 |
| 0.9347222222222222 | 0 |
| 0.9354166666666667 | 0 |
| 0.936111111111111 | 0 |
| 0.9368055555555556 | 0 |
| 0.9375 | 0 |
| 0.9381944444444444 | 0 |
| 0.938888888888889 | 0 |
| 0.9395833333333333 | 0 |
| 0.9402777777777778 | 0 |
| 0.9409722222222222 | 0 |
| 0.9416666666666668 | 0 |
| 0.9423611111111111 | 0 |
| 0.9430555555555555 | 0 |
| 0.94375 | 0 |
| 0.9444444444444445 | 0 |
| 0.9451388888888889 | 0 |
| 0.9458333333333333 | 0 |
| 0.9465277777777777 | 0 |
| 0.9472222222222223 | 0 |
| 0.9479166666666666 | 0 |
| 0.9486111111111111 | 0 |
| 0.9493055555555556 | 0 |
| 0.9500000000000001 | 0 |
| 0.9506944444444444 | 0 |
| 0.9513888888888888 | 0 |
| 0.9520833333333334 | 0 |
| 0.9527777777777778 | 0 |
| 0.9534722222222222 | 0 |
| 0.9541666666666666 | 0 |
| 0.9548611111111112 | 0 |
| 0.9555555555555556 | 0 |
| 0.9562499999999999 | 0 |
| 0.9569444444444444 | 0 |
| 0.9576388888888889 | 0 |
| 0.9583333333333334 | 0 |
| 0.9590277777777777 | 0 |
| 0.9597222222222223 | 0 |
| 0.9604166666666667 | 0 |
| 0.9611111111111111 | 0 |
| 0.9618055555555555 | 0 |
| 0.9625 | 0 |
| 0.9631944444444445 | 0 |
| 0.9638888888888889 | 0 |
| 0.9645833333333332 | 0 |
| 0.9652777777777778 | 0 |
| 0.9659722222222222 | 0 |
| 0.9666666666666667 | 0 |
| 0.967361111111111 | 0 |
| 0.9680555555555556 | 0 |
| 0.96875 | 0 |
| 0.9694444444444444 | 0 |
| 0.970138888888889 | 0 |
| 0.9708333333333333 | 0 |
| 0.9715277777777778 | 0 |
| 0.9722222222222222 | 0 |
| 0.9729166666666668 | 0 |
| 0.9736111111111111 | 0 |
| 0.9743055555555555 | 0 |
| 0.975 | 0 |
| 0.9756944444444445 | 0 |
| 0.9763888888888889 | 0 |
| 0.9770833333333333 | 0 |
| 0.9777777777777777 | 0 |
| 0.9784722222222223 | 0 |
| 0.9791666666666666 | 0 |
| 0.9798611111111111 | 0 |
| 0.9805555555555556 | 0 |
| 0.9812500000000001 | 0 |
| 0.9819444444444444 | 0 |
| 0.9826388888888888 | 0 |
| 0.9833333333333334 | 0 |
| 0.9840277777777778 | 0 |
| 0.9847222222222222 | 0 |
| 0.9854166666666666 | 0 |
| 0.9861111111111112 | 0 |
| 0.9868055555555556 | 0 |
| 0.9874999999999999 | 0 |
| 0.9881944444444444 | 0 |
| 0.9888888888888889 | 0 |
| 0.9895833333333334 | 0 |
| 0.9902777777777777 | 0 |
| 0.9909722222222223 | 0 |
| 0.9916666666666667 | 0 |
| 0.9923611111111111 | 0 |
| 0.9930555555555555 | 0 |
| 0.99375 | 0 |
| 0.9944444444444445 | 0 |
| 0.9951388888888889 | 0 |
| 0.9958333333333332 | 0 |
| 0.9965277777777778 | 0 |
| 0.9972222222222222 | 0 |
| 0.9979166666666667 | 0 |
| 0.998611111111111 | 0 |
| 0.9993055555555556 | 0 |